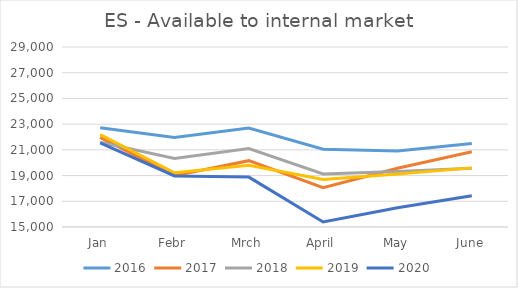
| Category | 2016 | 2017 | 2018 | 2019 | 2020 |
|---|---|---|---|---|---|
| Jan | 22713 | 21976.28 | 21586.829 | 22190.762 | 21548.198 |
| Febr | 21958 | 18986.816 | 20329.251 | 19217.932 | 18969.584 |
| Mrch | 22693 | 20158.962 | 21107.78 | 19807.963 | 18880.408 |
| April | 21045 | 18065.551 | 19123.204 | 18691.533 | 15387.419 |
| May | 20914 | 19570.857 | 19307.485 | 19130.605 | 16504.285 |
| June | 21487 | 20852.065 | 19560.513 | 19598.891 | 17429.734 |